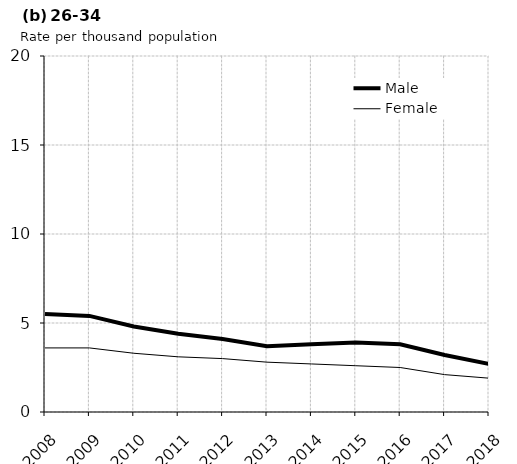
| Category | Male | Female |
|---|---|---|
| 2008.0 | 5.5 | 3.6 |
| 2009.0 | 5.4 | 3.6 |
| 2010.0 | 4.8 | 3.3 |
| 2011.0 | 4.4 | 3.1 |
| 2012.0 | 4.1 | 3 |
| 2013.0 | 3.7 | 2.8 |
| 2014.0 | 3.8 | 2.7 |
| 2015.0 | 3.9 | 2.6 |
| 2016.0 | 3.8 | 2.5 |
| 2017.0 | 3.2 | 2.1 |
| 2018.0 | 2.7 | 1.9 |